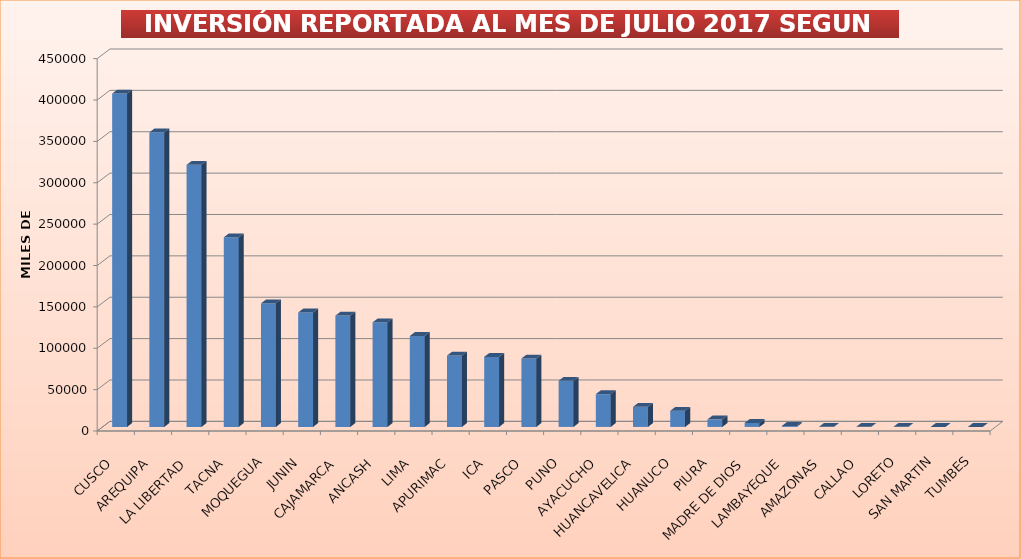
| Category | Series 0 |
|---|---|
| CUSCO | 402896.089 |
| AREQUIPA | 355987.071 |
| LA LIBERTAD | 316704.055 |
| TACNA | 229163.055 |
| MOQUEGUA | 149311.364 |
| JUNIN | 138316.593 |
| CAJAMARCA | 134533.51 |
| ANCASH | 126424.716 |
| LIMA | 109931.531 |
| APURIMAC | 86198.291 |
| ICA | 84650.4 |
| PASCO | 82713.732 |
| PUNO | 55817.446 |
| AYACUCHO | 39652.425 |
| HUANCAVELICA | 24285.067 |
| HUANUCO | 19498.435 |
| PIURA | 9127.485 |
| MADRE DE DIOS | 4806.789 |
| LAMBAYEQUE | 1204.157 |
| AMAZONAS | 214.472 |
| CALLAO | 196.2 |
| LORETO | 186.61 |
| SAN MARTIN | 31.49 |
| TUMBES | 16 |